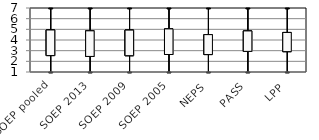
| Category | Series 0 | Series 1 | Series 2 | Series 3 |
|---|---|---|---|---|
| SOEP pooled | 2.54 | 7 | 1 | 4.94 |
| SOEP 2013 | 2.46 | 7 | 1 | 4.86 |
| SOEP 2009 | 2.53 | 7 | 1 | 4.93 |
| SOEP 2005 | 2.64 | 7 | 1 | 5.04 |
| NEPS | 2.635 | 7 | 1 | 4.505 |
| PASS | 2.934 | 7 | 1 | 4.85 |
| LPP | 2.909 | 7 | 1 | 4.707 |